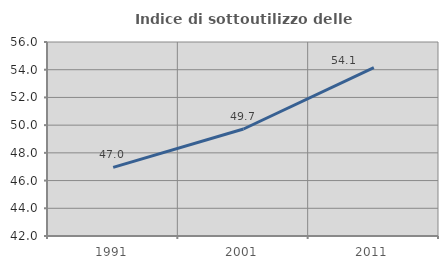
| Category | Indice di sottoutilizzo delle abitazioni  |
|---|---|
| 1991.0 | 46.951 |
| 2001.0 | 49.723 |
| 2011.0 | 54.144 |